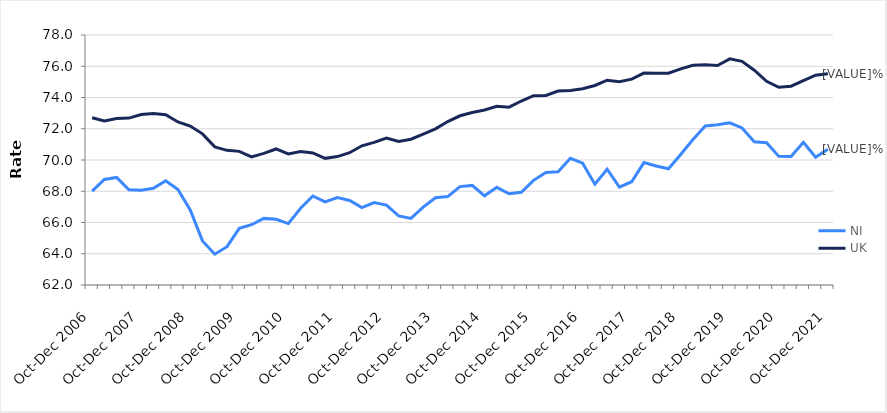
| Category | NI | UK |
|---|---|---|
| Oct-Dec 2006 | 68.01 | 72.707 |
| Jan-Mar 2007 | 68.751 | 72.502 |
| Apr-Jun 2007 | 68.883 | 72.651 |
| Jul-Sep 2007 | 68.091 | 72.683 |
| Oct-Dec 2007 | 68.059 | 72.909 |
| Jan-Mar 2008 | 68.193 | 72.976 |
| Apr-Jun 2008 | 68.674 | 72.9 |
| Jul-Sep 2008 | 68.114 | 72.436 |
| Oct-Dec 2008 | 66.798 | 72.174 |
| Jan-Mar 2009 | 64.822 | 71.673 |
| Apr-Jun 2009 | 63.973 | 70.84 |
| Jul-Sep 2009 | 64.453 | 70.617 |
| Oct-Dec 2009 | 65.629 | 70.552 |
| Jan-Mar 2010 | 65.858 | 70.195 |
| Apr-Jun 2010 | 66.264 | 70.423 |
| Jul-Sep 2010 | 66.205 | 70.705 |
| Oct-Dec 2010 | 65.931 | 70.39 |
| Jan-Mar 2011 | 66.913 | 70.546 |
| Apr-Jun 2011 | 67.699 | 70.45 |
| Jul-Sep 2011 | 67.317 | 70.105 |
| Oct-Dec 2011 | 67.599 | 70.218 |
| Jan-Mar 2012 | 67.412 | 70.467 |
| Apr-Jun 2012 | 66.955 | 70.908 |
| Jul-Sep 2012 | 67.271 | 71.131 |
| Oct-Dec 2012 | 67.111 | 71.404 |
| Jan-Mar 2013 | 66.421 | 71.18 |
| Apr-Jun 2013 | 66.259 | 71.332 |
| Jul-Sep 2013 | 66.99 | 71.654 |
| Oct-Dec 2013 | 67.584 | 71.994 |
| Jan-Mar 2014 | 67.657 | 72.46 |
| Apr-Jun 2014 | 68.296 | 72.83 |
| Jul-Sep 2014 | 68.375 | 73.043 |
| Oct-Dec 2014 | 67.708 | 73.203 |
| Jan-Mar 2015 | 68.249 | 73.437 |
| Apr-Jun 2015 | 67.839 | 73.383 |
| Jul-Sep 2015 | 67.93 | 73.776 |
| Oct-Dec 2015 | 68.699 | 74.112 |
| Jan-Mar 2016 | 69.205 | 74.135 |
| Apr-Jun 2016 | 69.246 | 74.417 |
| Jul-Sep 2016 | 70.107 | 74.447 |
| Oct-Dec 2016 | 69.8 | 74.566 |
| Jan-Mar 2017 | 68.449 | 74.769 |
| Apr-Jun 2017 | 69.411 | 75.104 |
| Jul-Sep 2017 | 68.262 | 75.007 |
| Oct-Dec 2017 | 68.61 | 75.175 |
| Jan-Mar 2018 | 69.833 | 75.561 |
| Apr-Jun 2018 | 69.62 | 75.549 |
| Jul-Sep 2018 | 69.441 | 75.553 |
| Oct-Dec 2018 | 70.349 | 75.833 |
| Jan-Mar 2019 | 71.307 | 76.057 |
| Apr-Jun 2019 | 72.176 | 76.102 |
| Jul-Sep 2019 | 72.253 | 76.047 |
| Oct-Dec 2019 | 72.378 | 76.471 |
| Jan-Mar 2020 | 72.055 | 76.313 |
| Apr-Jun 2020 | 71.167 | 75.748 |
| Jul-Sep 2020 | 71.11 | 75.033 |
| Oct-Dec 2020 | 70.232 | 74.654 |
| Jan-Mar 2021 | 70.218 | 74.725 |
| Apr-Jun 2021 | 71.13 | 75.072 |
| Jul-Sep 2021 | 70.18 | 75.427 |
| Oct-Dec 2021 | 70.695 | 75.516 |